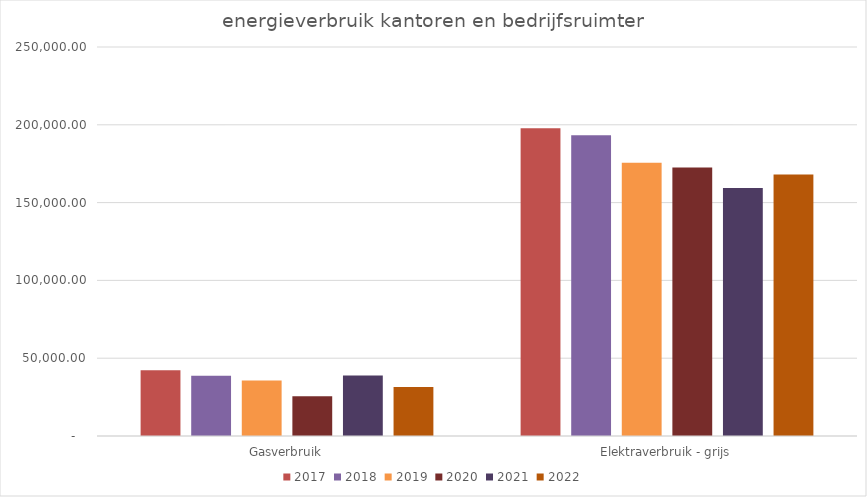
| Category | 2017 | 2018 | 2019 | 2020 | 2021 | 2022 |
|---|---|---|---|---|---|---|
| Gasverbruik | 42235 | 38745 | 35639 | 25551 | 38812 | 31528 |
| Elektraverbruik - grijs | 197809 | 193309 | 175542 | 172629 | 159456 | 168108.514 |